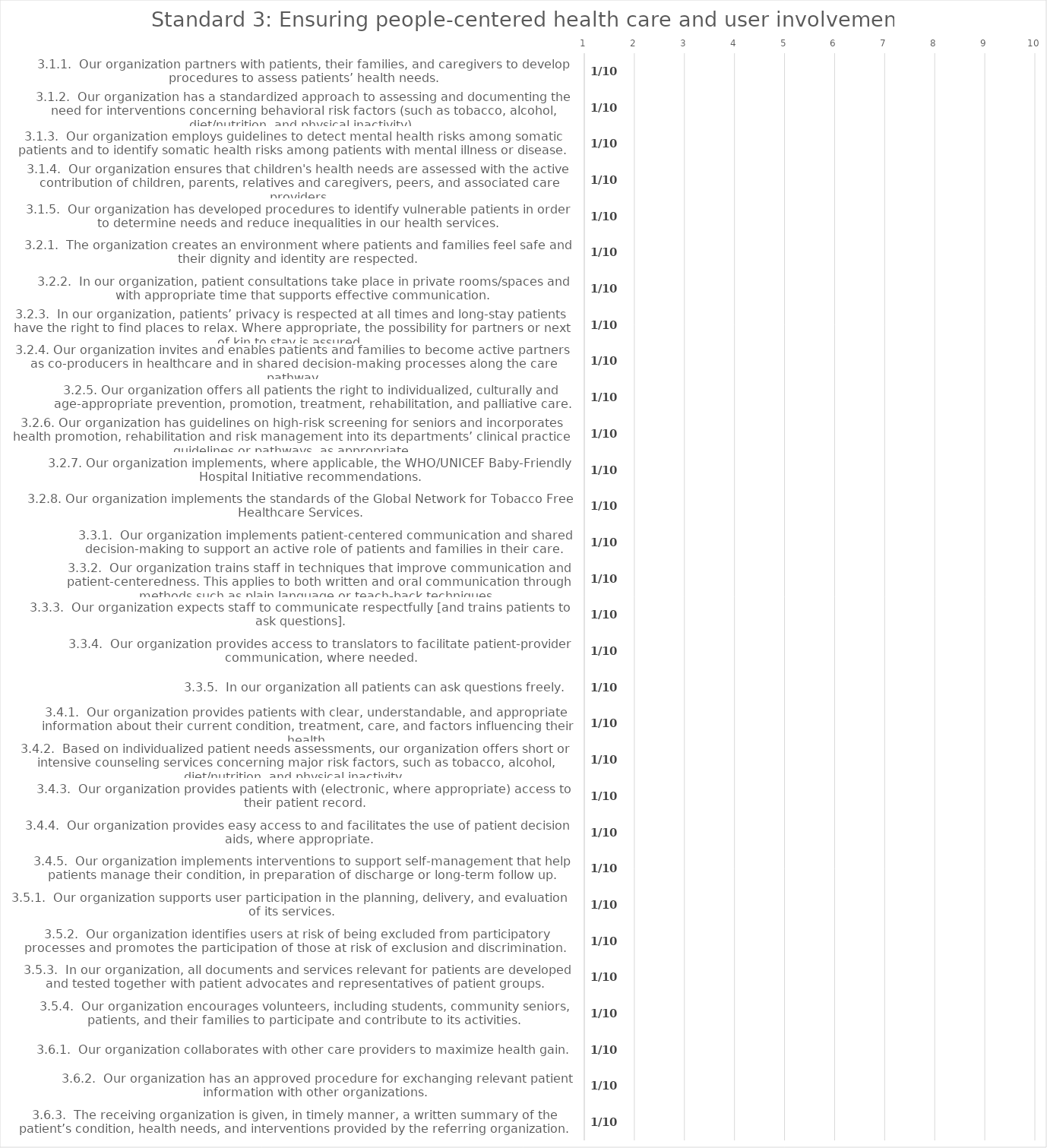
| Category | value |
|---|---|
| 3.1.1.  Our organization partners with patients, their families, and caregivers to develop procedures to assess patients’ health needs. | 1 |
| 3.1.2.  Our organization has a standardized approach to assessing and documenting the need for interventions concerning behavioral risk factors (such as tobacco, alcohol, diet/nutrition, and physical inactivity). | 1 |
| 3.1.3.  Our organization employs guidelines to detect mental health risks among somatic patients and to identify somatic health risks among patients with mental illness or disease. | 1 |
| 3.1.4.  Our organization ensures that children's health needs are assessed with the active contribution of children, parents, relatives and caregivers, peers, and associated care providers. | 1 |
| 3.1.5.  Our organization has developed procedures to identify vulnerable patients in order to determine needs and reduce inequalities in our health services. | 1 |
| 3.2.1.  The organization creates an environment where patients and families feel safe and their dignity and identity are respected. | 1 |
| 3.2.2.  In our organization, patient consultations take place in private rooms/spaces and with appropriate time that supports effective communication.  | 1 |
| 3.2.3.  In our organization, patients’ privacy is respected at all times and long-stay patients have the right to find places to relax. Where appropriate, the possibility for partners or next of kin to stay is assured.  | 1 |
| 3.2.4. Our organization invites and enables patients and families to become active partners as co-producers in healthcare and in shared decision-making processes along the care pathway. | 1 |
| 3.2.5. Our organization offers all patients the right to individualized, culturally and age-appropriate prevention, promotion, treatment, rehabilitation, and palliative care. | 1 |
| 3.2.6. Our organization has guidelines on high-risk screening for seniors and incorporates health promotion, rehabilitation and risk management into its departments’ clinical practice guidelines or pathways, as appropriate. | 1 |
| 3.2.7. Our organization implements, where applicable, the WHO/UNICEF Baby-Friendly Hospital Initiative recommendations. | 1 |
| 3.2.8. Our organization implements the standards of the Global Network for Tobacco Free Healthcare Services. | 1 |
| 3.3.1.  Our organization implements patient-centered communication and shared decision-making to support an active role of patients and families in their care. | 1 |
| 3.3.2.  Our organization trains staff in techniques that improve communication and patient-centeredness. This applies to both written and oral communication through methods such as plain language or teach-back techniques.  | 1 |
| 3.3.3.  Our organization expects staff to communicate respectfully [and trains patients to ask questions]. | 1 |
| 3.3.4.  Our organization provides access to translators to facilitate patient-provider communication, where needed. | 1 |
| 3.3.5.  In our organization all patients can ask questions freely.  | 1 |
| 3.4.1.  Our organization provides patients with clear, understandable, and appropriate information about their current condition, treatment, care, and factors influencing their health. | 1 |
| 3.4.2.  Based on individualized patient needs assessments, our organization offers short or intensive counseling services concerning major risk factors, such as tobacco, alcohol, diet/nutrition, and physical inactivity. | 1 |
| 3.4.3.  Our organization provides patients with (electronic, where appropriate) access to their patient record. | 1 |
| 3.4.4.  Our organization provides easy access to and facilitates the use of patient decision aids, where appropriate. | 1 |
| 3.4.5.  Our organization implements interventions to support self-management that help patients manage their condition, in preparation of discharge or long-term follow up. | 1 |
| 3.5.1.  Our organization supports user participation in the planning, delivery, and evaluation of its services. | 1 |
| 3.5.2.  Our organization identifies users at risk of being excluded from participatory processes and promotes the participation of those at risk of exclusion and discrimination.  | 1 |
| 3.5.3.  In our organization, all documents and services relevant for patients are developed and tested together with patient advocates and representatives of patient groups.  | 1 |
| 3.5.4.  Our organization encourages volunteers, including students, community seniors, patients, and their families to participate and contribute to its activities. | 1 |
| 3.6.1.  Our organization collaborates with other care providers to maximize health gain. | 1 |
| 3.6.2.  Our organization has an approved procedure for exchanging relevant patient information with other organizations.  | 1 |
| 3.6.3.  The receiving organization is given, in timely manner, a written summary of the patient’s condition, health needs, and interventions provided by the referring organization. | 1 |